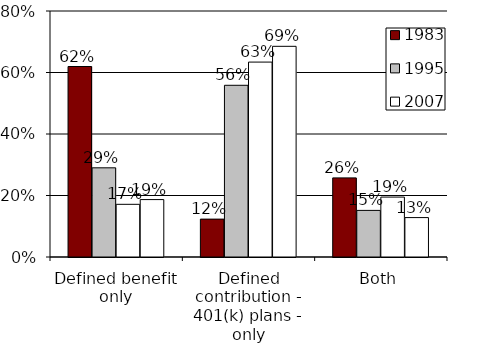
| Category | 1983 | 1995 | 2007 | 2010 |
|---|---|---|---|---|
| Defined benefit only | 0.619 | 0.29 | 0.171 | 0.187 |
| Defined contribution - 401(k) plans - only | 0.123 | 0.558 | 0.634 | 0.685 |
| Both | 0.257 | 0.152 | 0.195 | 0.128 |